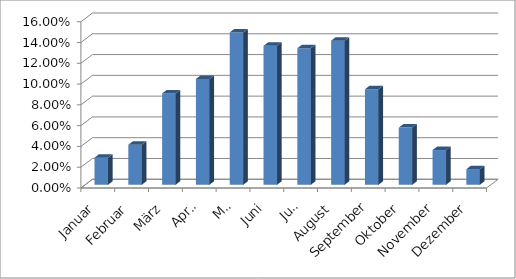
| Category | Series 0 |
|---|---|
| Januar | 0.026 |
| Februar | 0.038 |
| März | 0.088 |
| April | 0.102 |
| Mai | 0.147 |
| Juni | 0.134 |
| Juli | 0.131 |
| August | 0.139 |
| September | 0.092 |
| Oktober | 0.055 |
| November | 0.033 |
| Dezember | 0.015 |